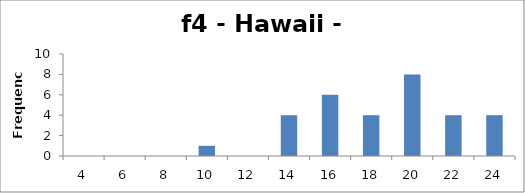
| Category | Frequency |
|---|---|
| 4.0 | 0 |
| 6.0 | 0 |
| 8.0 | 0 |
| 10.0 | 1 |
| 12.0 | 0 |
| 14.0 | 4 |
| 16.0 | 6 |
| 18.0 | 4 |
| 20.0 | 8 |
| 22.0 | 4 |
| 24.0 | 4 |